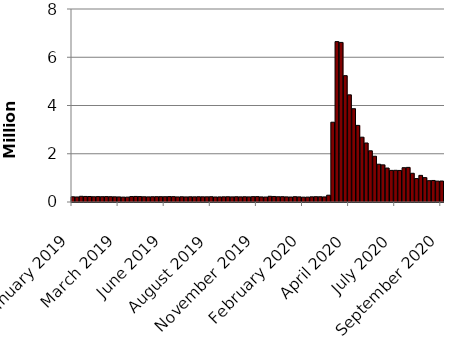
| Category | Series 0 |
|---|---|
| January 2019 | 216000 |
| January 2019 | 209000 |
| January 2019 | 236000 |
| February 2019 | 230000 |
| February 2019 | 228000 |
| February 2019 | 218000 |
| February 2019 | 224000 |
| March 2019 | 220000 |
| March 2019 | 224000 |
| March 2019 | 219000 |
| March 2019 | 215000 |
| March 2019 | 211000 |
| April 2019 | 203000 |
| April 2019 | 203000 |
| April 2019 | 226000 |
| April 2019 | 230000 |
| May 2019 | 225000 |
| May 2019 | 217000 |
| May 2019 | 213000 |
| May 2019 | 218000 |
| June 2019 | 220000 |
| June 2019 | 220000 |
| June 2019 | 219000 |
| June 2019 | 224000 |
| June 2019 | 222000 |
| July 2019 | 211000 |
| July 2019 | 217000 |
| July 2019 | 211000 |
| July 2019 | 216000 |
| August 2019 | 214000 |
| August 2019 | 218000 |
| August 2019 | 215000 |
| August 2019 | 215000 |
| August 2019 | 219000 |
| September 2019 | 208000 |
| September 2019 | 211000 |
| September 2019 | 215000 |
| September 2019 | 218000 |
| October 2019 | 212000 |
| October 2019 | 218000 |
| September 2019 | 213000 |
| September 2019 | 217000 |
| November 2019 | 212000 |
| November 2019 | 222000 |
| November 2019 | 223000 |
| November 2019 | 211000 |
| November 2019 | 206000 |
| December 2019 | 237000 |
| December 2019 | 229000 |
| December 2019 | 218000 |
| December 2019 | 220000 |
| January 2020 | 212000 |
| January 2020 | 207000 |
| January 2020 | 220000 |
| January 2020 | 212000 |
| February 2020 | 201000 |
| February 2020 | 204000 |
| February 2020 | 215000 |
| February 2020 | 220000 |
| February 2020 | 217000 |
| March 2020 | 211000 |
| March 2020 | 282000 |
| 2020 Mar | 3307000 |
| March 2020 | 6648000 |
| April 2020 | 6615000 |
| April 2020 | 5237000 |
| April 2020 | 4442000 |
| April 2020 | 3867000 |
| May 2020 | 3176000 |
| May 2020 | 2687000 |
| May 2020 | 2446000 |
| May 2020 | 2123000 |
| May 2020 | 1897000 |
| June 2020 | 1566000 |
| June 2020 | 1540000 |
| June 2020 | 1408000 |
| June 2020 | 1310000 |
| July 2020 | 1314000 |
| July 2020 | 1308000 |
| July 2020 | 1422000 |
| July 2020 | 1435000 |
| August 2020 | 1191000 |
| August 2020 | 971000 |
| August 2020 | 1104000 |
| August 2020 | 1011000 |
| August 2020 | 884000 |
| September 2020 | 893000 |
| September 2020 | 866000 |
| September 2020 | 870000 |